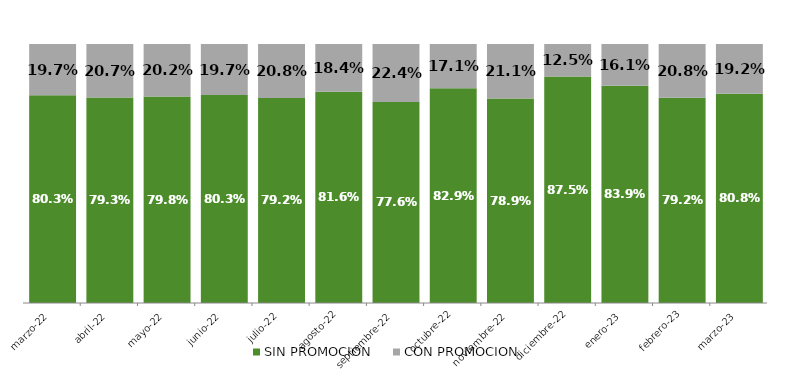
| Category | SIN PROMOCION   | CON PROMOCION   |
|---|---|---|
| 2022-03-01 | 0.803 | 0.197 |
| 2022-04-01 | 0.793 | 0.207 |
| 2022-05-01 | 0.798 | 0.202 |
| 2022-06-01 | 0.803 | 0.197 |
| 2022-07-01 | 0.792 | 0.208 |
| 2022-08-01 | 0.816 | 0.184 |
| 2022-09-01 | 0.776 | 0.224 |
| 2022-10-01 | 0.829 | 0.171 |
| 2022-11-01 | 0.789 | 0.211 |
| 2022-12-01 | 0.875 | 0.125 |
| 2023-01-01 | 0.839 | 0.161 |
| 2023-02-01 | 0.792 | 0.208 |
| 2023-03-01 | 0.808 | 0.192 |